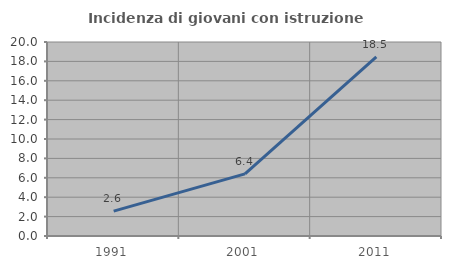
| Category | Incidenza di giovani con istruzione universitaria |
|---|---|
| 1991.0 | 2.564 |
| 2001.0 | 6.4 |
| 2011.0 | 18.478 |